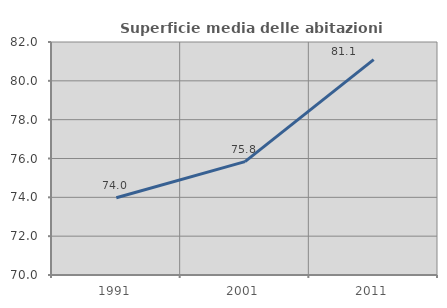
| Category | Superficie media delle abitazioni occupate |
|---|---|
| 1991.0 | 73.979 |
| 2001.0 | 75.837 |
| 2011.0 | 81.089 |